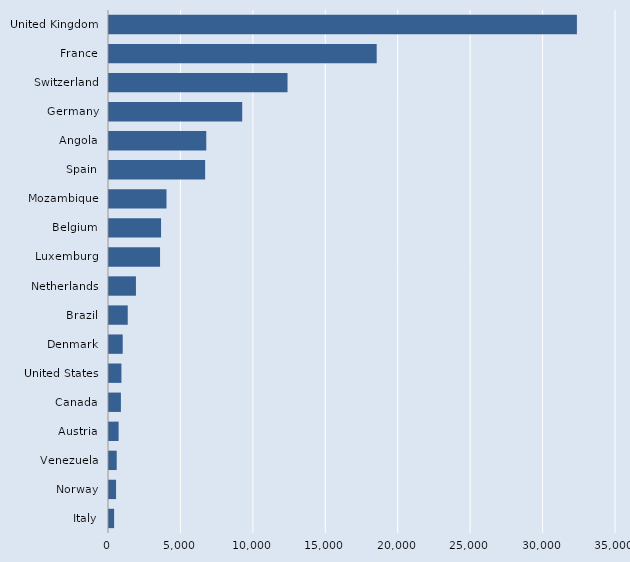
| Category | Series 0 |
|---|---|
| Italy | 354 |
| Norway | 488 |
| Venezuela | 532 |
| Austria | 663 |
| Canada | 822 |
| United States | 857 |
| Denmark | 947 |
| Brazil | 1294 |
| Netherlands | 1860 |
| Luxemburg | 3525 |
| Belgium | 3594 |
| Mozambique | 3971 |
| Spain | 6638 |
| Angola | 6715 |
| Germany | 9195 |
| Switzerland | 12325 |
| France | 18480 |
| United Kingdom | 32301 |